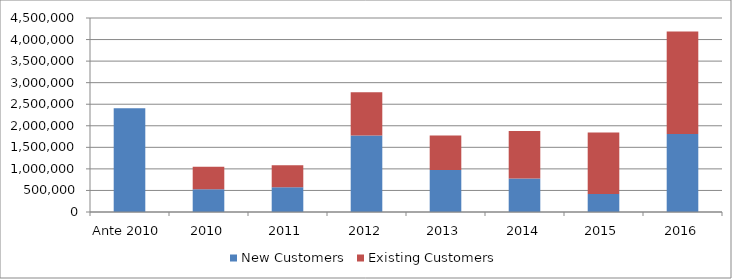
| Category | New Customers | Existing Customers |
|---|---|---|
| Ante 2010 | 2406750 | 0 |
| 2010 | 525800 | 524500 |
| 2011 | 576800 | 506448 |
| 2012 | 1773000 | 1007437 |
| 2013 | 975000.4 | 797435.923 |
| 2014 | 776500 | 1101488.2 |
| 2015 | 420000 | 1425853 |
| 2016 | 1806399.644 | 2380426.44 |